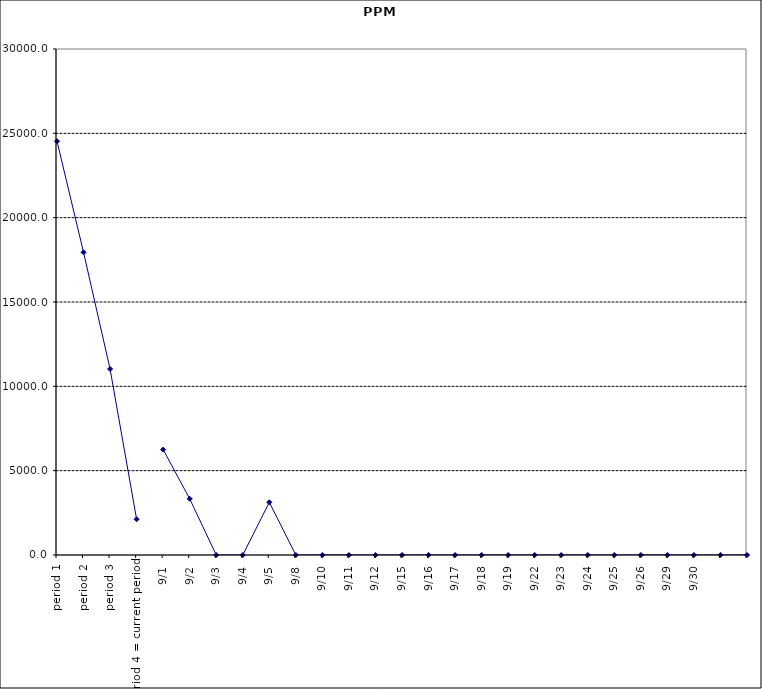
| Category | Series 0 |
|---|---|
| period 1 | 24531.25 |
| period 2 | 17945.205 |
| period 3 | 11029.412 |
| period 4 = current period | 2116.402 |
| 9/1 | 6250 |
| 9/2 | 3333.333 |
| 9/3 | 0 |
| 9/4 | 0 |
| 9/5 | 3125 |
| 9/8 | 0 |
| 9/10 | 0 |
| 9/11 | 0 |
| 9/12 | 0 |
| 9/15 | 0 |
| 9/16 | 0 |
| 9/17 | 0 |
| 9/18 | 0 |
| 9/19 | 0 |
| 9/22 | 0 |
| 9/23 | 0 |
| 9/24 | 0 |
| 9/25 | 0 |
| 9/26 | 0 |
| 9/29 | 0 |
| 9/30 | 0 |